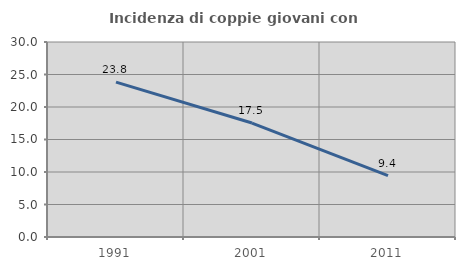
| Category | Incidenza di coppie giovani con figli |
|---|---|
| 1991.0 | 23.817 |
| 2001.0 | 17.534 |
| 2011.0 | 9.436 |